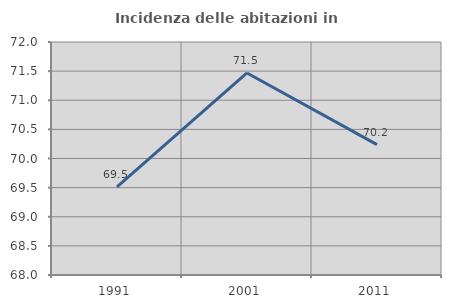
| Category | Incidenza delle abitazioni in proprietà  |
|---|---|
| 1991.0 | 69.513 |
| 2001.0 | 71.468 |
| 2011.0 | 70.239 |